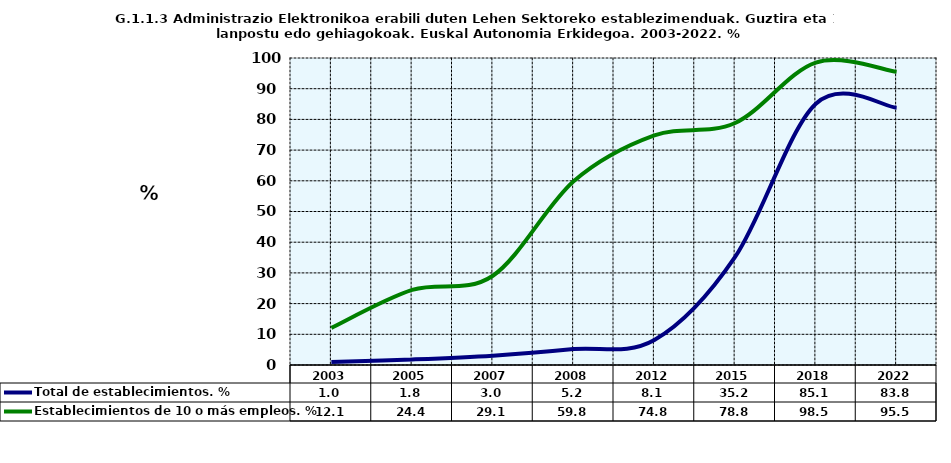
| Category | Total de establecimientos. % | Establecimientos de 10 o más empleos. % |
|---|---|---|
| 2003.0 | 0.969 | 12.077 |
| 2005.0 | 1.791 | 24.444 |
| 2007.0 | 3.033 | 29.082 |
| 2008.0 | 5.176 | 59.848 |
| 2012.0 | 8.118 | 74.8 |
| 2015.0 | 35.191 | 78.832 |
| 2018.0 | 85.112 | 98.519 |
| 2022.0 | 83.771 | 95.489 |